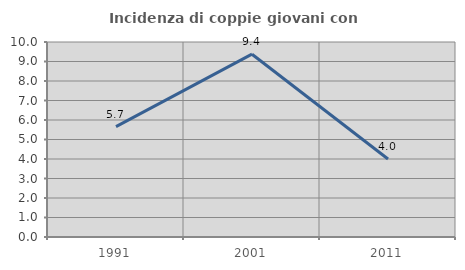
| Category | Incidenza di coppie giovani con figli |
|---|---|
| 1991.0 | 5.66 |
| 2001.0 | 9.375 |
| 2011.0 | 4 |